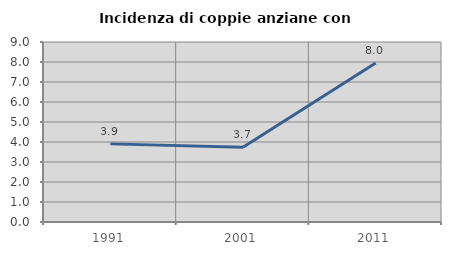
| Category | Incidenza di coppie anziane con figli |
|---|---|
| 1991.0 | 3.906 |
| 2001.0 | 3.738 |
| 2011.0 | 7.955 |